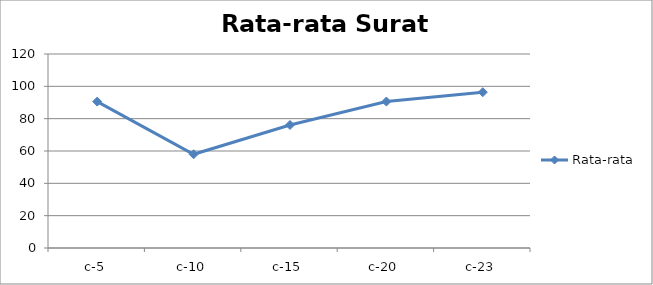
| Category | Rata-rata |
|---|---|
| c-5 | 90.58 |
| c-10 | 57.971 |
| c-15 | 76.087 |
| c-20 | 90.58 |
| c-23 | 96.377 |